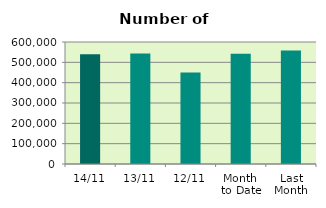
| Category | Series 0 |
|---|---|
| 14/11 | 540060 |
| 13/11 | 542872 |
| 12/11 | 449798 |
| Month 
to Date | 542686.8 |
| Last
Month | 558199.478 |